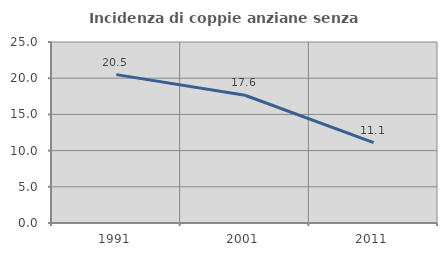
| Category | Incidenza di coppie anziane senza figli  |
|---|---|
| 1991.0 | 20.492 |
| 2001.0 | 17.647 |
| 2011.0 | 11.111 |